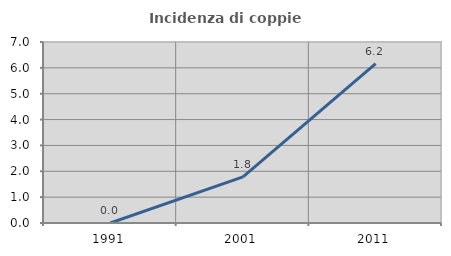
| Category | Incidenza di coppie miste |
|---|---|
| 1991.0 | 0 |
| 2001.0 | 1.786 |
| 2011.0 | 6.164 |